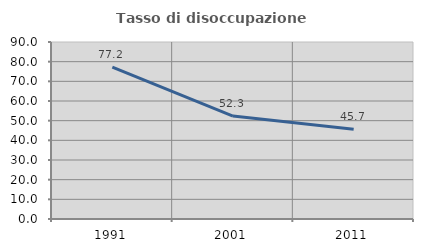
| Category | Tasso di disoccupazione giovanile  |
|---|---|
| 1991.0 | 77.215 |
| 2001.0 | 52.344 |
| 2011.0 | 45.652 |